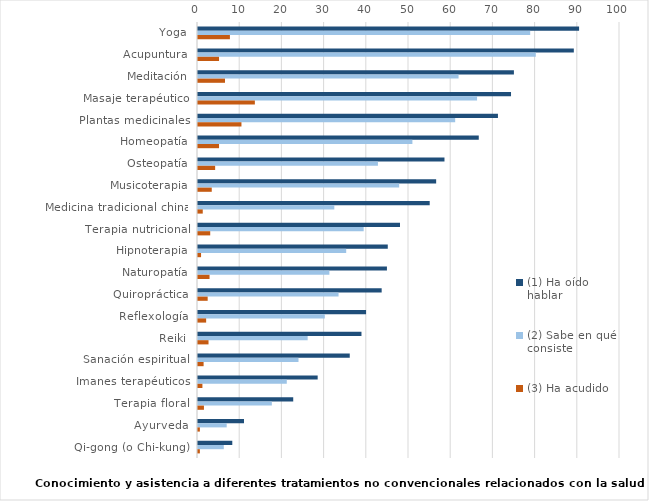
| Category | (1) Ha oído hablar | (2) Sabe en qué consiste | (3) Ha acudido |
|---|---|---|---|
| Yoga | 90.306 | 78.721 | 7.562 |
| Acupuntura | 89.059 | 80.048 | 4.988 |
| Meditación | 74.859 | 61.746 | 6.396 |
| Masaje terapéutico | 74.175 | 66.13 | 13.475 |
| Plantas medicinales | 71.078 | 60.941 | 10.298 |
| Homeopatía | 66.533 | 50.805 | 4.988 |
| Osteopatía | 58.407 | 42.639 | 4.063 |
| Musicoterapia | 56.436 | 47.667 | 3.258 |
| Medicina tradicional china | 54.907 | 32.301 | 1.126 |
| Terapia nutricional | 47.868 | 39.26 | 2.896 |
| Hipnoterapia | 44.972 | 35.117 | 0.724 |
| Naturopatía | 44.771 | 31.134 | 2.735 |
| Quiropráctica | 43.524 | 33.307 | 2.293 |
| Reflexología | 39.823 | 30.048 | 1.931 |
| Reiki | 38.737 | 25.986 | 2.494 |
| Sanación espiritual | 35.961 | 23.813 | 1.327 |
| Imanes terapéuticos | 28.359 | 21.038 | 1.046 |
| Terapia floral | 22.566 | 17.498 | 1.408 |
| Ayurveda | 10.901 | 6.798 | 0.442 |
| Qi-gong (o Chi-kung) | 8.126 | 6.114 | 0.442 |